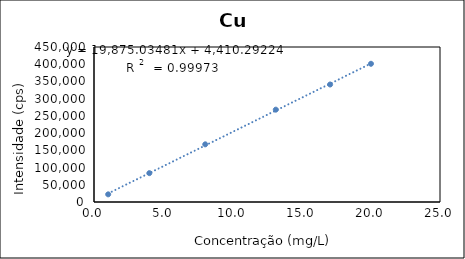
| Category | Series 0 |
|---|---|
| 1.0246791769775574 | 22232.748 |
| 3.998189256742326 | 83775.448 |
| 8.037659630061228 | 167420.248 |
| 13.136012657219071 | 268073.248 |
| 17.061084763586315 | 341145.248 |
| 20.012222676256748 | 401305.248 |